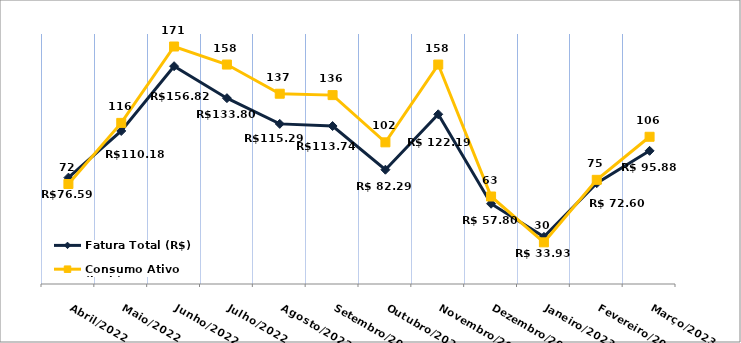
| Category | Fatura Total (R$) | Consumo Ativo (kWh) |
|---|---|---|
| Abril/2022 | 76.59 | 72 |
| Maio/2022 | 110.18 | 116 |
| Junho/2022 | 156.82 | 171 |
| Julho/2022 | 133.8 | 158 |
| Agosto/2022 | 115.29 | 137 |
| Setembro/2022 | 113.74 | 136 |
| Outubro/2022 | 82.29 | 102 |
| Novembro/2022 | 122.19 | 158 |
| Dezembro/2022 | 57.8 | 63 |
| Janeiro/2023 | 33.93 | 30 |
| Fevereiro/2023 | 72.6 | 75 |
| Março/2023 | 95.88 | 106 |